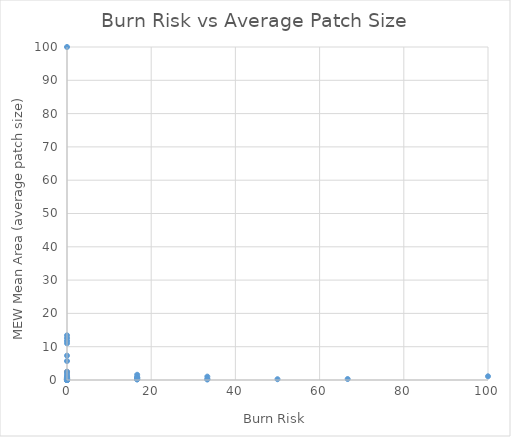
| Category | MEWMeanArea |
|---|---|
| 0.0 | 0.46 |
| 0.0 | 0.645 |
| 0.0 | 2.426 |
| 0.0 | 100 |
| 0.0 | 11.728 |
| 0.0 | 7.319 |
| 0.0 | 0.438 |
| 0.0 | 12.574 |
| 0.0 | 0.156 |
| 0.0 | 5.69 |
| 0.0 | 11.008 |
| 0.0 | 13.408 |
| 0.0 | 0.546 |
| 0.0 | 1.936 |
| 0.0 | 0.1 |
| 0.0 | 0.035 |
| 16.666666666666668 | 0.197 |
| 16.666666666666668 | 1.569 |
| 0.0 | 0.426 |
| 0.0 | 0.91 |
| 0.0 | 0.64 |
| 0.0 | 0.068 |
| 0.0 | 0.044 |
| 0.0 | 0.864 |
| 0.0 | 0.428 |
| 0.0 | 0.23 |
| 0.0 | 0.172 |
| 0.0 | 0.073 |
| 0.0 | 0.219 |
| 0.0 | 0.491 |
| 0.0 | 0.39 |
| 0.0 | 0.125 |
| 0.0 | 0.294 |
| 0.0 | 0.096 |
| 0.0 | 1.379 |
| 33.333333333333336 | 1.016 |
| 16.666666666666668 | 0.807 |
| 16.666666666666668 | 0.594 |
| 33.333333333333336 | 0.235 |
| 0.0 | 0.423 |
| 16.666666666666668 | 0.252 |
| 100.0 | 1.111 |
| 50.0 | 0.234 |
| 66.66666666666667 | 0.292 |
| 33.333333333333336 | 0.165 |
| 0.0 | 0.145 |
| 0.0 | 0.038 |
| 0.0 | 0.167 |
| 0.0 | 0.053 |
| 0.0 | 0.156 |
| 0.0 | 0.167 |
| 0.0 | 0.324 |
| 0.0 | 0.402 |
| 0.0 | 0.042 |
| 0.0 | 0.594 |
| 0.0 | 0.291 |
| 0.0 | 0.209 |
| 0.0 | 0.495 |
| 0.0 | 0.217 |
| 0.0 | 0.436 |
| 0.0 | 0.264 |
| 0.0 | 0.346 |
| 0.0 | 0.839 |
| 0.0 | 0.316 |
| 16.666666666666668 | 0.205 |
| 16.666666666666668 | 0.386 |
| 0.0 | 2.495 |
| 0.0 | 0 |
| 0.0 | 0.029 |
| 0.0 | 0.037 |
| 0.0 | 0.037 |
| 0.0 | 0.132 |
| 0.0 | 0.023 |
| 0.0 | 0.045 |
| 0.0 | 0.147 |
| 0.0 | 0.048 |
| 0.0 | 0.437 |
| 0.0 | 0.826 |
| 16.666666666666668 | 0.75 |